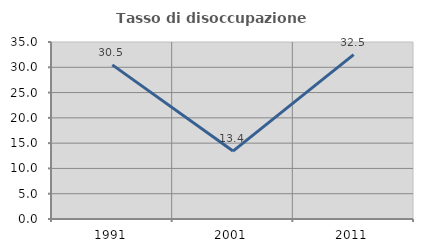
| Category | Tasso di disoccupazione giovanile  |
|---|---|
| 1991.0 | 30.476 |
| 2001.0 | 13.433 |
| 2011.0 | 32.5 |